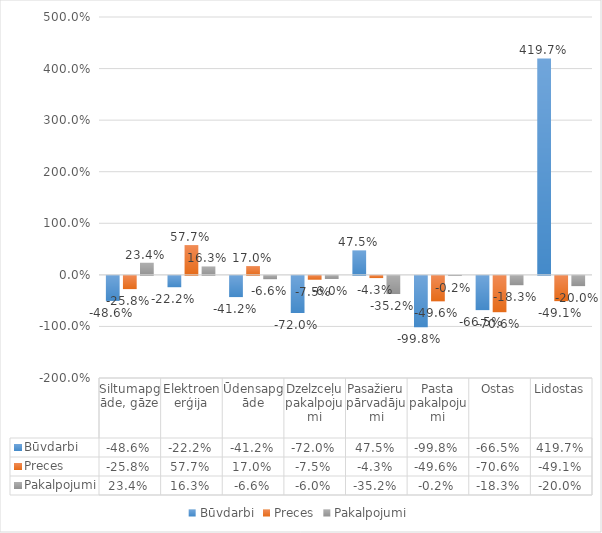
| Category | Būvdarbi | Preces | Pakalpojumi |
|---|---|---|---|
| Siltumapgāde, gāze | -0.486 | -0.258 | 0.234 |
| Elektroenerģija | -0.222 | 0.577 | 0.163 |
| Ūdensapgāde | -0.412 | 0.17 | -0.066 |
| Dzelzceļu pakalpojumi | -0.72 | -0.075 | -0.06 |
| Pasažieru pārvadājumi | 0.475 | -0.043 | -0.352 |
| Pasta pakalpojumi | -0.998 | -0.496 | -0.002 |
| Ostas | -0.665 | -0.706 | -0.183 |
| Lidostas | 4.197 | -0.491 | -0.2 |